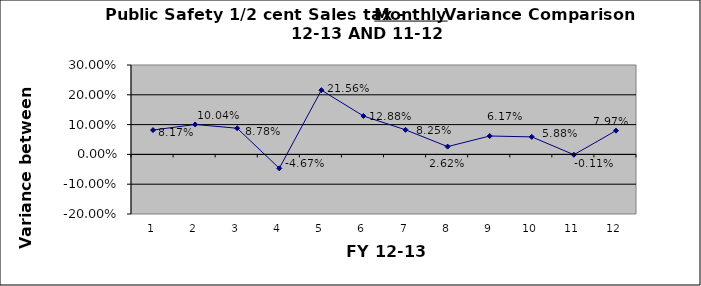
| Category | September October November December January February March April May June  July August |
|---|---|
| 0 | 0.082 |
| 1 | 0.1 |
| 2 | 0.088 |
| 3 | -0.047 |
| 4 | 0.216 |
| 5 | 0.129 |
| 6 | 0.082 |
| 7 | 0.026 |
| 8 | 0.062 |
| 9 | 0.059 |
| 10 | -0.001 |
| 11 | 0.08 |